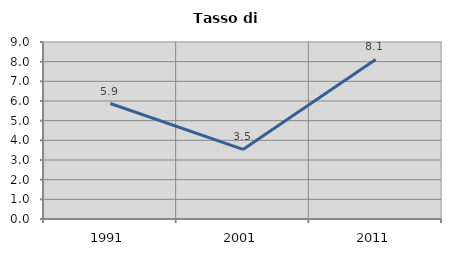
| Category | Tasso di disoccupazione   |
|---|---|
| 1991.0 | 5.871 |
| 2001.0 | 3.536 |
| 2011.0 | 8.114 |